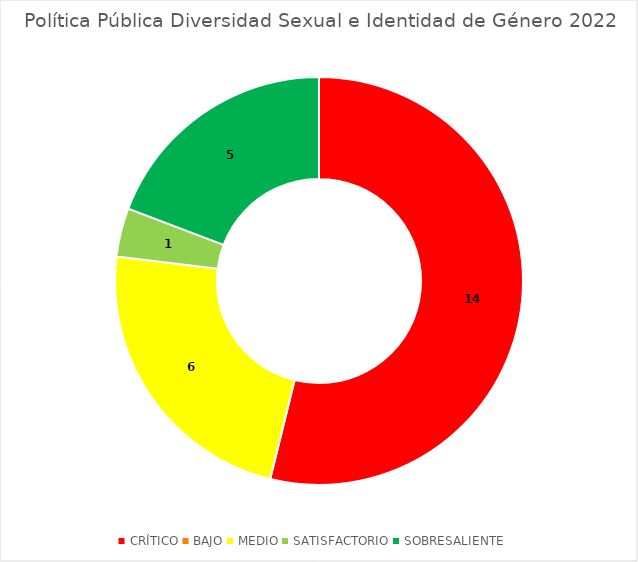
| Category | CANTIDAD |
|---|---|
| CRÍTICO | 14 |
| BAJO | 0 |
| MEDIO | 6 |
| SATISFACTORIO | 1 |
| SOBRESALIENTE | 5 |